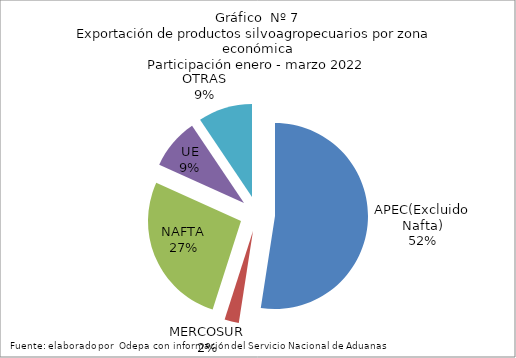
| Category | Series 0 |
|---|---|
| APEC(Excluido Nafta) | 2972065.633 |
| MERCOSUR | 141070.512 |
| NAFTA | 1519513.989 |
| UE | 499888.829 |
| OTRAS | 534453.037 |